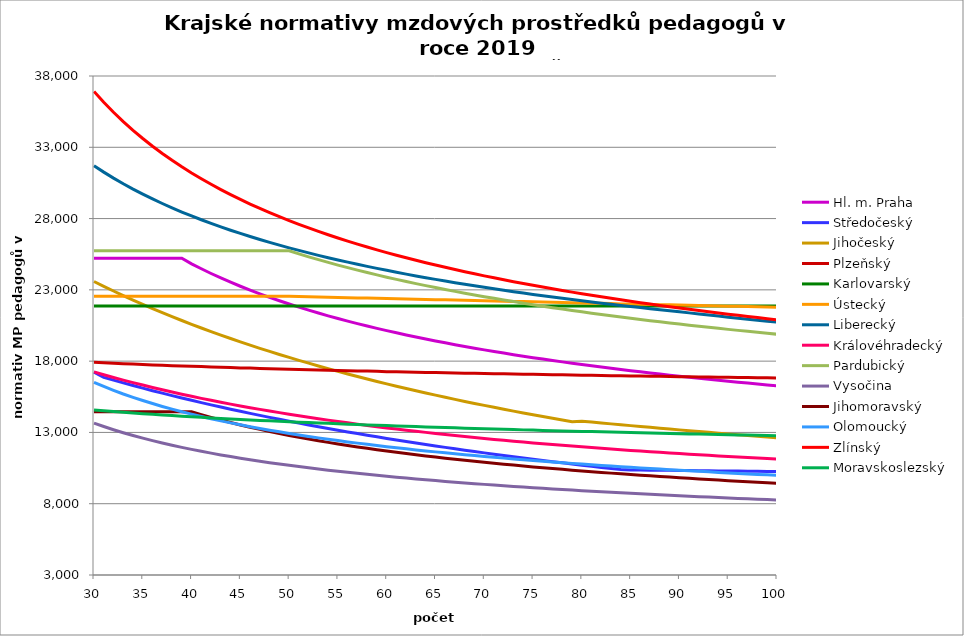
| Category | Hl. m. Praha | Středočeský | Jihočeský | Plzeňský | Karlovarský  | Ústecký   | Liberecký | Královéhradecký | Pardubický | Vysočina | Jihomoravský | Olomoucký | Zlínský | Moravskoslezský |
|---|---|---|---|---|---|---|---|---|---|---|---|---|---|---|
| 30.0 | 25224.633 | 17234.4 | 23587.972 | 17914.323 | 21866.667 | 22548.82 | 31702.323 | 17245.296 | 25740.36 | 13651.125 | 14447.609 | 16509.001 | 36913.932 | 14573.566 |
| 31.0 | 25224.633 | 16863.405 | 23248.818 | 17883.369 | 21866.667 | 22548.82 | 31257.349 | 17044.856 | 25740.36 | 13413.117 | 14447.609 | 16222.294 | 36159.393 | 14516.678 |
| 32.0 | 25224.633 | 16667.698 | 22919.279 | 17852.523 | 21866.667 | 22548.82 | 30838.246 | 16856.194 | 25740.36 | 13190 | 14447.609 | 15951.708 | 35457.634 | 14460.233 |
| 33.0 | 25224.633 | 16476.482 | 22598.952 | 17821.782 | 21866.667 | 22548.82 | 30442.629 | 16671.663 | 25740.36 | 12981.115 | 14447.609 | 15696.131 | 34802.986 | 14409.299 |
| 34.0 | 25224.633 | 16289.603 | 22287.455 | 17791.147 | 21866.667 | 22548.82 | 30068.405 | 16491.129 | 25740.36 | 12784.28 | 14447.609 | 15460.508 | 34190.578 | 14358.722 |
| 35.0 | 25224.633 | 16106.916 | 21984.428 | 17768.24 | 21866.667 | 22548.82 | 29713.729 | 16321.187 | 25740.36 | 12599.085 | 14447.609 | 15237.633 | 33616.2 | 14313.506 |
| 36.0 | 25224.633 | 15928.281 | 21689.531 | 17737.789 | 21866.667 | 22548.82 | 29376.972 | 16154.712 | 25740.36 | 12424.035 | 14447.609 | 15026.712 | 33076.198 | 14268.573 |
| 37.0 | 25224.633 | 15753.565 | 21402.44 | 17715.019 | 21866.667 | 22548.82 | 29056.684 | 15991.599 | 25740.36 | 12258.509 | 14447.609 | 14821.55 | 32567.379 | 14223.922 |
| 38.0 | 25224.633 | 15582.64 | 21122.851 | 17684.75 | 21866.667 | 22548.82 | 28751.575 | 15831.747 | 25740.36 | 12101.588 | 14447.609 | 14632.568 | 32086.942 | 14179.549 |
| 39.0 | 25224.633 | 15415.385 | 20850.472 | 17662.116 | 21866.667 | 22548.82 | 28460.49 | 15681.267 | 25740.36 | 11952.436 | 14447.609 | 14453.544 | 31632.419 | 14135.453 |
| 40.0 | 24824.809 | 15251.681 | 20585.028 | 17639.54 | 21866.667 | 22548.82 | 28182.392 | 15533.621 | 25740.36 | 11810.629 | 14447.609 | 14283.926 | 31201.628 | 14096.485 |
| 41.0 | 24478.019 | 15091.419 | 20326.258 | 17617.021 | 21866.667 | 22548.82 | 27916.346 | 15388.729 | 25740.36 | 11675.447 | 14245.756 | 14118.243 | 30792.629 | 14057.732 |
| 42.0 | 24148.802 | 14934.489 | 20073.913 | 17594.56 | 21866.667 | 22548.82 | 27661.511 | 15252.388 | 25740.36 | 11546.55 | 14049.466 | 13961.21 | 30403.695 | 14019.191 |
| 43.0 | 23835.767 | 14780.789 | 19827.757 | 17572.156 | 21866.667 | 22548.82 | 27417.122 | 15118.442 | 25740.36 | 11423.31 | 13867.936 | 13812.38 | 30033.277 | 13980.861 |
| 44.0 | 23537.669 | 14630.221 | 19587.564 | 17549.809 | 21866.667 | 22548.82 | 27182.486 | 14986.828 | 25740.36 | 11305.457 | 13691.037 | 13671.341 | 29679.991 | 13947.494 |
| 45.0 | 23253.39 | 14482.689 | 19353.122 | 17527.519 | 21866.667 | 22548.82 | 26956.974 | 14857.486 | 25740.36 | 11192.739 | 13523.077 | 13533.154 | 29342.586 | 13909.555 |
| 46.0 | 22981.923 | 14338.103 | 19124.225 | 17512.69 | 21866.667 | 22548.82 | 26740.008 | 14735.839 | 25740.36 | 11084.328 | 13363.565 | 13402.202 | 29019.936 | 13876.526 |
| 47.0 | 22722.362 | 14196.376 | 18900.679 | 17490.494 | 21866.667 | 22548.82 | 26531.063 | 14616.168 | 25740.36 | 10980.624 | 13212.051 | 13278.149 | 28711.02 | 13843.655 |
| 48.0 | 22473.882 | 14057.423 | 18682.299 | 17468.354 | 21866.667 | 22548.82 | 26329.656 | 14498.425 | 25740.36 | 10880.847 | 13063.933 | 13156.371 | 28414.913 | 13810.939 |
| 49.0 | 22235.737 | 13921.163 | 18468.908 | 17453.626 | 21866.667 | 22548.82 | 26135.344 | 14387.791 | 25740.36 | 10784.838 | 12923.194 | 13041.039 | 28130.773 | 13783.019 |
| 50.0 | 22007.249 | 13787.52 | 18260.336 | 17431.579 | 21866.667 | 22548.82 | 25947.719 | 14273.684 | 25740.36 | 10692.168 | 12789.464 | 12931.874 | 27857.832 | 13750.588 |
| 51.0 | 21787.797 | 13656.418 | 18056.423 | 17416.912 | 21866.667 | 22534.823 | 25766.406 | 14166.44 | 25523.495 | 10603.254 | 12662.403 | 12820.428 | 27595.387 | 13718.31 |
| 52.0 | 21576.816 | 13527.786 | 17857.013 | 17394.958 | 21866.667 | 22520.844 | 25591.058 | 14065.79 | 25316.634 | 10517.146 | 12537.842 | 12718.936 | 27342.797 | 13690.763 |
| 53.0 | 21373.786 | 13401.555 | 17661.96 | 17380.353 | 21866.667 | 22506.882 | 25421.354 | 13961.636 | 25116.945 | 10434.269 | 12419.488 | 12619.039 | 27099.471 | 13663.327 |
| 54.0 | 21178.232 | 13277.658 | 17471.122 | 17365.772 | 21866.667 | 22479.009 | 25256.996 | 13863.866 | 24924.028 | 10354.244 | 12303.348 | 12520.698 | 26864.867 | 13636 |
| 55.0 | 20989.716 | 13156.031 | 17284.364 | 17343.946 | 21866.667 | 22465.099 | 25097.707 | 13767.455 | 24737.512 | 10276.716 | 12193.004 | 12427.723 | 26638.486 | 13608.782 |
| 56.0 | 20807.834 | 13036.611 | 17101.557 | 17329.427 | 21866.667 | 22451.206 | 24943.232 | 13672.376 | 24557.053 | 10201.6 | 12084.622 | 12336.118 | 26419.866 | 13581.673 |
| 57.0 | 20632.214 | 12919.34 | 16922.575 | 17314.931 | 21866.667 | 22437.33 | 24793.332 | 13583.259 | 24382.334 | 10129.064 | 11981.669 | 12249.588 | 26208.581 | 13554.672 |
| 58.0 | 20462.513 | 12804.16 | 16747.302 | 17300.46 | 21866.667 | 22423.471 | 24647.783 | 13490.698 | 24213.058 | 10058.776 | 11883.916 | 12164.264 | 26004.237 | 13527.778 |
| 59.0 | 20298.411 | 12691.016 | 16575.622 | 17286.013 | 21866.667 | 22409.63 | 24506.378 | 13403.927 | 24048.951 | 9990.665 | 11787.746 | 12080.12 | 25806.468 | 13505.447 |
| 60.0 | 20139.614 | 12579.854 | 16407.426 | 17264.387 | 21866.667 | 22395.805 | 24368.923 | 13318.264 | 23889.756 | 9924.424 | 11693.119 | 12000.717 | 25614.934 | 13478.748 |
| 61.0 | 19985.846 | 12470.622 | 16242.609 | 17250 | 21866.667 | 22381.998 | 24235.236 | 13238.114 | 23735.236 | 9860.232 | 11603.3 | 11922.351 | 25429.319 | 13456.579 |
| 62.0 | 19836.853 | 12363.271 | 16081.071 | 17235.637 | 21866.667 | 22354.433 | 24105.146 | 13158.923 | 23585.166 | 9798.027 | 11518.102 | 11848.496 | 25249.328 | 13430.072 |
| 63.0 | 19692.396 | 12257.752 | 15922.714 | 17221.298 | 21866.667 | 22340.677 | 23978.493 | 13076.354 | 23439.338 | 9737.29 | 11430.942 | 11775.55 | 25074.688 | 13408.063 |
| 64.0 | 19552.254 | 12154.02 | 15767.445 | 17206.983 | 21866.667 | 22326.937 | 23855.128 | 13003.35 | 23297.557 | 9678.435 | 11351.406 | 11703.497 | 24905.14 | 13386.126 |
| 65.0 | 19416.22 | 12052.028 | 15615.175 | 17199.834 | 21866.667 | 22313.215 | 23734.91 | 12926.934 | 23159.64 | 9621.184 | 11269.854 | 11635.689 | 24740.447 | 13364.26 |
| 66.0 | 19284.1 | 11951.734 | 15465.819 | 17185.554 | 21866.667 | 22299.509 | 23617.705 | 12851.412 | 23025.415 | 9565.491 | 11192.536 | 11568.664 | 24580.383 | 13342.466 |
| 67.0 | 19155.713 | 11853.095 | 15319.292 | 17171.298 | 21866.667 | 22285.82 | 23503.389 | 12780.891 | 22894.721 | 9511.097 | 11116.271 | 11502.405 | 24424.737 | 13320.742 |
| 68.0 | 19030.889 | 11756.071 | 15175.516 | 17157.066 | 21866.667 | 22272.147 | 23391.844 | 12711.14 | 22767.406 | 9458.184 | 11044.029 | 11436.902 | 24273.314 | 13299.09 |
| 69.0 | 18909.468 | 11660.622 | 15034.413 | 17142.857 | 21866.667 | 22244.853 | 23282.958 | 12642.146 | 22643.327 | 9406.713 | 10972.72 | 11375.361 | 24125.926 | 13277.507 |
| 70.0 | 18791.301 | 11566.711 | 14895.91 | 17128.672 | 21866.667 | 22231.231 | 23176.626 | 12577.891 | 22522.349 | 9356.434 | 10905.241 | 11314.479 | 23982.4 | 13255.995 |
| 71.0 | 18676.247 | 11474.301 | 14759.936 | 17121.588 | 21866.667 | 22217.625 | 23072.749 | 12510.332 | 22404.347 | 9307.32 | 10835.707 | 11254.245 | 23842.572 | 13238.835 |
| 72.0 | 18564.174 | 11383.355 | 14626.422 | 17107.438 | 21866.667 | 22204.037 | 22971.232 | 12447.406 | 22289.199 | 9259.548 | 10769.897 | 11197.77 | 23706.287 | 13217.447 |
| 73.0 | 18454.956 | 11293.84 | 14495.301 | 17093.311 | 21866.667 | 22190.465 | 22871.987 | 12385.111 | 22176.794 | 9212.881 | 10707.692 | 11141.859 | 23573.399 | 13200.387 |
| 74.0 | 18348.475 | 11205.722 | 14366.511 | 17079.208 | 21866.667 | 22176.909 | 22774.929 | 12327.273 | 22067.022 | 9167.292 | 10643.424 | 11086.503 | 23443.77 | 13179.124 |
| 75.0 | 18244.621 | 11118.968 | 14239.989 | 17072.165 | 21866.667 | 22163.37 | 22679.977 | 12266.171 | 21959.784 | 9122.756 | 10582.667 | 11031.695 | 23317.272 | 13162.162 |
| 76.0 | 18143.289 | 11033.547 | 14115.676 | 17058.096 | 21866.667 | 22149.847 | 22587.056 | 12209.436 | 21854.983 | 9079.249 | 10525.316 | 10980.426 | 23193.779 | 13141.022 |
| 77.0 | 18044.379 | 10949.428 | 13993.514 | 17044.051 | 21866.667 | 22122.852 | 22496.093 | 12153.223 | 21752.529 | 9036.551 | 10465.897 | 10926.659 | 23073.177 | 13124.158 |
| 78.0 | 17947.798 | 10866.583 | 13873.449 | 17037.037 | 21866.667 | 22109.379 | 22407.02 | 12097.525 | 21652.334 | 8995.036 | 10409.801 | 10876.361 | 22955.355 | 13107.337 |
| 79.0 | 17853.455 | 10784.981 | 13755.427 | 17023.026 | 21866.667 | 22095.922 | 22319.77 | 12042.336 | 21554.317 | 8954.288 | 10354.303 | 10829.442 | 22840.209 | 13090.56 |
| 80.0 | 17761.268 | 10704.596 | 13788.129 | 17016.03 | 21866.667 | 22082.482 | 22234.283 | 11987.648 | 21458.399 | 8914.485 | 10301.995 | 10780.032 | 22727.638 | 13073.826 |
| 81.0 | 17671.155 | 10625.401 | 13724.734 | 17002.053 | 21866.667 | 22069.058 | 22150.497 | 11937.052 | 21364.508 | 8875.416 | 10247.638 | 10733.939 | 22617.55 | 13057.134 |
| 82.0 | 17583.041 | 10547.368 | 13661.919 | 16995.074 | 21866.667 | 22055.65 | 22068.357 | 11886.881 | 21272.571 | 8837.255 | 10196.4 | 10685.395 | 22509.855 | 13040.485 |
| 83.0 | 17496.854 | 10470.474 | 13599.676 | 16981.132 | 21866.667 | 22042.259 | 21987.809 | 11837.13 | 21182.523 | 8799.796 | 10145.672 | 10640.106 | 22404.467 | 13023.878 |
| 84.0 | 17412.525 | 10394.692 | 13537.998 | 16974.17 | 21866.667 | 22015.525 | 21908.801 | 11787.794 | 21094.299 | 8763.21 | 10097.945 | 10597.995 | 22301.307 | 13007.313 |
| 85.0 | 17329.989 | 10369.675 | 13476.877 | 16960.262 | 21866.667 | 22002.182 | 21831.284 | 11738.867 | 21007.837 | 8727.296 | 10048.189 | 10553.442 | 22200.296 | 12990.791 |
| 86.0 | 17249.183 | 10362.193 | 13416.306 | 16953.317 | 21866.667 | 21988.855 | 21755.21 | 11693.798 | 20923.081 | 8692.041 | 10001.373 | 10512.013 | 22101.361 | 12974.31 |
| 87.0 | 17170.048 | 10354.722 | 13356.276 | 16939.444 | 21866.667 | 21975.545 | 21680.535 | 11645.647 | 20839.974 | 8657.432 | 9954.991 | 10468.178 | 22004.433 | 12957.871 |
| 88.0 | 17092.529 | 10347.262 | 13296.781 | 16932.515 | 21866.667 | 21962.25 | 21607.216 | 11601.289 | 20758.463 | 8623.638 | 9909.038 | 10427.414 | 21909.445 | 12941.474 |
| 89.0 | 17016.57 | 10339.813 | 13237.814 | 16918.676 | 21866.667 | 21948.972 | 21535.211 | 11557.268 | 20678.497 | 8590.464 | 9865.893 | 10386.967 | 21816.333 | 12929.204 |
| 90.0 | 16942.121 | 10332.374 | 13179.368 | 16911.765 | 21866.667 | 21935.71 | 21464.481 | 11516.928 | 20600.029 | 8557.899 | 9823.121 | 10349.498 | 21725.037 | 12912.879 |
| 91.0 | 16869.133 | 10324.946 | 13121.435 | 16904.859 | 21866.667 | 21922.464 | 21385.963 | 11473.544 | 20523.011 | 8525.755 | 9778.374 | 10309.651 | 21635.497 | 12896.595 |
| 92.0 | 16797.558 | 10317.529 | 13064.01 | 16891.065 | 21866.667 | 21896.019 | 21308.867 | 11433.786 | 20447.399 | 8494.376 | 9738.682 | 10272.737 | 21547.66 | 12884.409 |
| 93.0 | 16727.352 | 10310.122 | 13007.085 | 16884.176 | 21866.667 | 21882.821 | 21233.149 | 11391.024 | 20373.151 | 8463.575 | 9697.004 | 10236.086 | 21461.47 | 12868.198 |
| 94.0 | 16658.473 | 10302.726 | 12950.654 | 16877.293 | 21866.667 | 21869.639 | 21158.768 | 11351.835 | 20300.226 | 8433.339 | 9655.682 | 10197.106 | 21376.879 | 12856.065 |
| 95.0 | 16590.878 | 10295.341 | 12894.71 | 16863.544 | 21866.667 | 21856.472 | 21085.685 | 11312.914 | 20228.584 | 8403.491 | 9616.977 | 10160.992 | 21293.836 | 12839.925 |
| 96.0 | 16524.528 | 10287.966 | 12839.248 | 16856.678 | 21866.667 | 21843.321 | 21013.864 | 11277.471 | 20158.189 | 8374.361 | 9578.581 | 10127.685 | 21212.296 | 12827.846 |
| 97.0 | 16459.387 | 10280.601 | 12784.26 | 16849.817 | 21866.667 | 21830.186 | 20943.266 | 11239.058 | 20089.003 | 8345.602 | 9540.491 | 10092.06 | 21132.213 | 12811.776 |
| 98.0 | 16395.418 | 10273.247 | 12729.742 | 16836.112 | 21866.667 | 21817.067 | 20873.858 | 11204.075 | 20020.994 | 8317.207 | 9502.703 | 10056.685 | 21053.544 | 12799.75 |
| 99.0 | 16332.586 | 10265.904 | 12675.687 | 16829.268 | 21866.667 | 21790.876 | 20805.606 | 11166.159 | 19954.127 | 8289.504 | 9465.212 | 10024.058 | 20976.249 | 12787.746 |
| 100.0 | 16270.857 | 10258.571 | 12622.089 | 16822.43 | 21866.667 | 21777.804 | 20738.479 | 11131.628 | 19888.37 | 8262.15 | 9430.197 | 9991.642 | 20900.288 | 12771.776 |